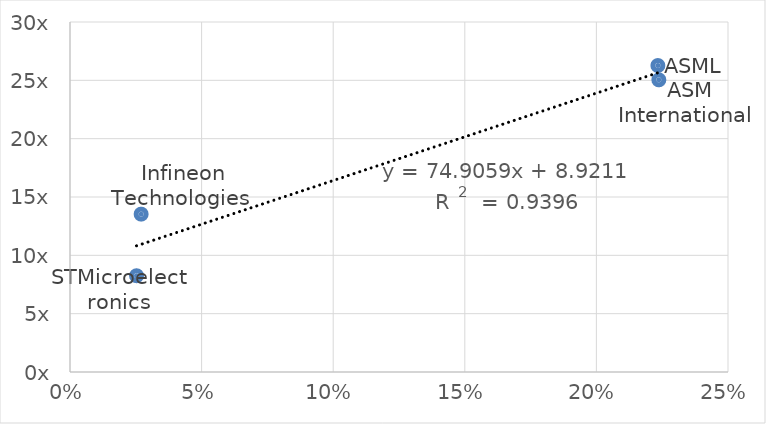
| Category | Series 0 |
|---|---|
| 0.22335800728469035 | 26.269 |
| 0.025280281380523295 | 8.251 |
| 0.027027027027026973 | 13.531 |
| 0.22372372372372373 | 25.041 |